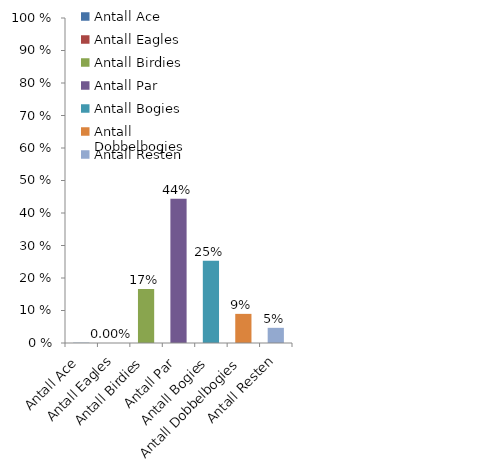
| Category | Series 0 |
|---|---|
| Antall Ace | 0.001 |
| Antall Eagles | 0 |
| Antall Birdies | 0.166 |
| Antall Par | 0.444 |
| Antall Bogies | 0.253 |
| Antall Dobbelbogies | 0.09 |
| Antall Resten | 0.047 |